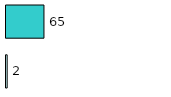
| Category | Series 0 | Series 1 |
|---|---|---|
| 0 | 2 | 65 |